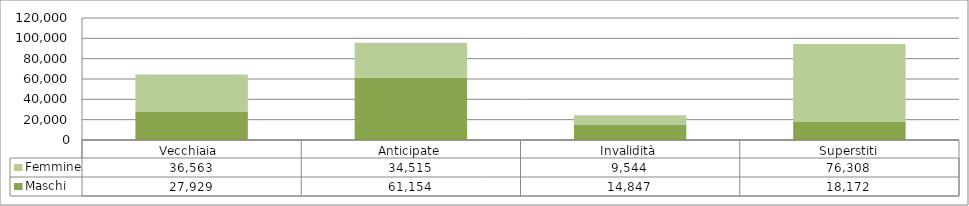
| Category | Maschi | Femmine |
|---|---|---|
| Vecchiaia  | 27929 | 36563 |
| Anticipate | 61154 | 34515 |
| Invalidità | 14847 | 9544 |
| Superstiti | 18172 | 76308 |